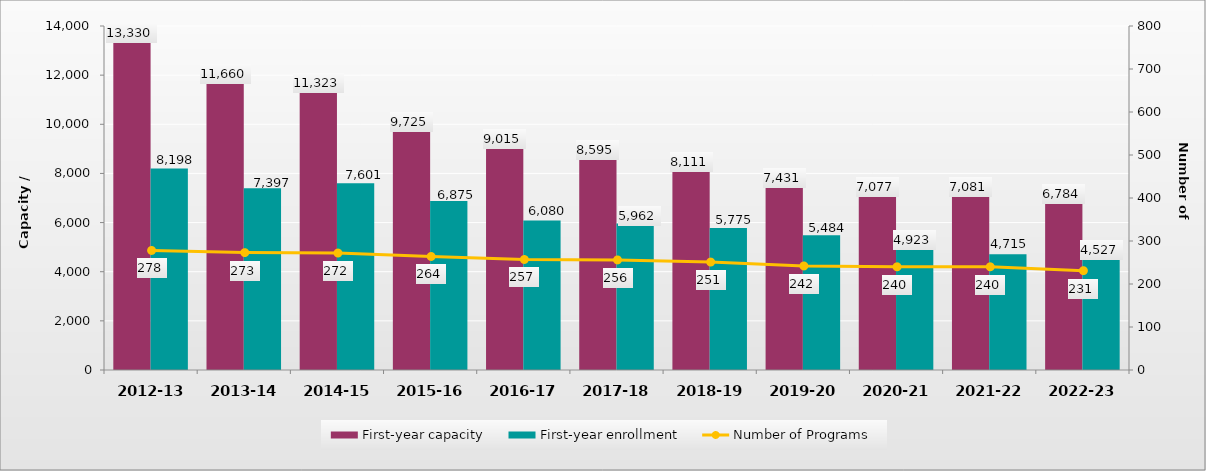
| Category | First-year capacity | First-year enrollment |
|---|---|---|
| 2012-13 | 13330 | 8198 |
| 2013-14 | 11660 | 7397 |
| 2014-15 | 11323 | 7601 |
| 2015-16 | 9725 | 6875 |
| 2016-17 | 9015 | 6080 |
| 2017-18 | 8595 | 5962 |
| 2018-19 | 8111 | 5775 |
| 2019-20 | 7431 | 5484 |
| 2020-21 | 7077 | 4923 |
| 2021-22 | 7081 | 4715 |
| 2022-23 | 6784 | 4527 |